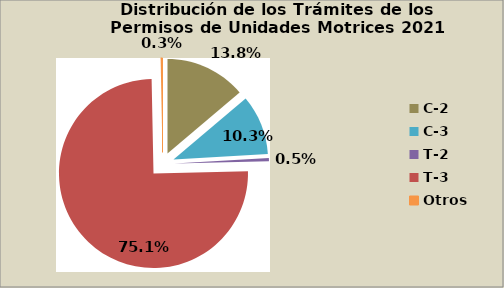
| Category | Series 0 |
|---|---|
| C-2 | 13.817 |
| C-3 | 10.268 |
| T-2 | 0.522 |
| T-3 | 75.074 |
| Otros | 0.319 |